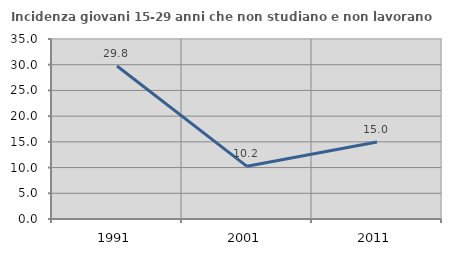
| Category | Incidenza giovani 15-29 anni che non studiano e non lavorano  |
|---|---|
| 1991.0 | 29.762 |
| 2001.0 | 10.244 |
| 2011.0 | 14.97 |